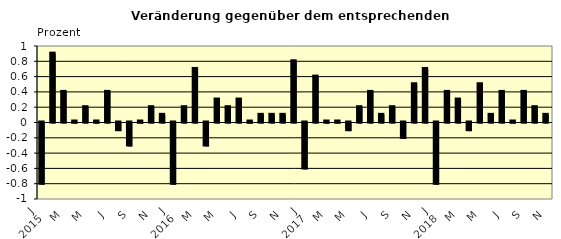
| Category | Series 0 |
|---|---|
| 0 | -0.8 |
| 1 | 0.9 |
| 2 | 0.4 |
| 3 | 0.01 |
| 4 | 0.2 |
| 5 | 0.01 |
| 6 | 0.4 |
| 7 | -0.1 |
| 8 | -0.3 |
| 9 | 0.01 |
| 10 | 0.2 |
| 11 | 0.1 |
| 12 | -0.8 |
| 13 | 0.2 |
| 14 | 0.7 |
| 15 | -0.3 |
| 16 | 0.3 |
| 17 | 0.2 |
| 18 | 0.3 |
| 19 | 0.01 |
| 20 | 0.1 |
| 21 | 0.1 |
| 22 | 0.1 |
| 23 | 0.8 |
| 24 | -0.6 |
| 25 | 0.6 |
| 26 | 0.01 |
| 27 | 0.01 |
| 28 | -0.1 |
| 29 | 0.2 |
| 30 | 0.4 |
| 31 | 0.1 |
| 32 | 0.2 |
| 33 | -0.2 |
| 34 | 0.5 |
| 35 | 0.7 |
| 36 | -0.8 |
| 37 | 0.4 |
| 38 | 0.3 |
| 39 | -0.1 |
| 40 | 0.5 |
| 41 | 0.1 |
| 42 | 0.4 |
| 43 | 0.01 |
| 44 | 0.4 |
| 45 | 0.2 |
| 46 | 0.1 |